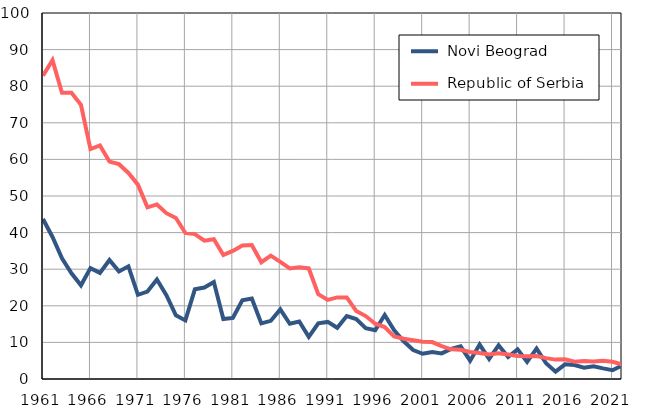
| Category |  Novi Beograd |  Republic of Serbia |
|---|---|---|
| 1961.0 | 43.7 | 82.9 |
| 1962.0 | 38.8 | 87.1 |
| 1963.0 | 33 | 78.2 |
| 1964.0 | 28.9 | 78.2 |
| 1965.0 | 25.6 | 74.9 |
| 1966.0 | 30.3 | 62.8 |
| 1967.0 | 29 | 63.8 |
| 1968.0 | 32.5 | 59.4 |
| 1969.0 | 29.4 | 58.7 |
| 1970.0 | 30.8 | 56.3 |
| 1971.0 | 23 | 53.1 |
| 1972.0 | 23.9 | 46.9 |
| 1973.0 | 27.2 | 47.7 |
| 1974.0 | 22.9 | 45.3 |
| 1975.0 | 17.4 | 44 |
| 1976.0 | 16 | 39.9 |
| 1977.0 | 24.5 | 39.6 |
| 1978.0 | 25 | 37.8 |
| 1979.0 | 26.5 | 38.2 |
| 1980.0 | 16.4 | 33.9 |
| 1981.0 | 16.7 | 35 |
| 1982.0 | 21.5 | 36.5 |
| 1983.0 | 22 | 36.6 |
| 1984.0 | 15.2 | 31.9 |
| 1985.0 | 15.9 | 33.7 |
| 1986.0 | 19 | 32 |
| 1987.0 | 15.1 | 30.2 |
| 1988.0 | 15.7 | 30.5 |
| 1989.0 | 11.5 | 30.2 |
| 1990.0 | 15.2 | 23.2 |
| 1991.0 | 15.6 | 21.6 |
| 1992.0 | 14 | 22.3 |
| 1993.0 | 17.2 | 22.3 |
| 1994.0 | 16.4 | 18.6 |
| 1995.0 | 13.9 | 17.2 |
| 1996.0 | 13.3 | 15.1 |
| 1997.0 | 17.5 | 14.2 |
| 1998.0 | 13.3 | 11.6 |
| 1999.0 | 10.3 | 11 |
| 2000.0 | 7.9 | 10.6 |
| 2001.0 | 6.9 | 10.2 |
| 2002.0 | 7.4 | 10.1 |
| 2003.0 | 7 | 9 |
| 2004.0 | 8.2 | 8.1 |
| 2005.0 | 8.9 | 8 |
| 2006.0 | 5 | 7.4 |
| 2007.0 | 9.4 | 7.1 |
| 2008.0 | 5.5 | 6.7 |
| 2009.0 | 9.2 | 7 |
| 2010.0 | 6 | 6.7 |
| 2011.0 | 8.1 | 6.3 |
| 2012.0 | 4.7 | 6.2 |
| 2013.0 | 8.3 | 6.3 |
| 2014.0 | 4.3 | 5.7 |
| 2015.0 | 2 | 5.3 |
| 2016.0 | 4 | 5.4 |
| 2017.0 | 3.8 | 4.7 |
| 2018.0 | 3.1 | 4.9 |
| 2019.0 | 3.5 | 4.8 |
| 2020.0 | 2.9 | 5 |
| 2021.0 | 2.4 | 4.7 |
| 2022.0 | 3.7 | 4 |